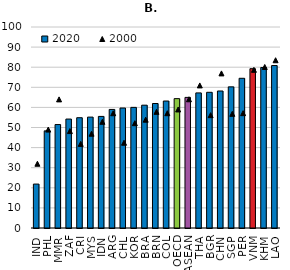
| Category | 2020 |
|---|---|
| IND | 21.852 |
| PHL | 48.333 |
| MMR | 51.464 |
| ZAF | 54.204 |
| CRI | 54.87 |
| MYS | 55.171 |
| IDN | 55.518 |
| ARG | 58.989 |
| CHL | 59.691 |
| KOR | 60.011 |
| BRA | 61.101 |
| BRN | 61.936 |
| COL | 63.172 |
| OECD | 64.358 |
| ASEAN | 64.98 |
| THA | 67.214 |
| BGR | 67.509 |
| CHN | 68.16 |
| SGP | 70.214 |
| PER | 74.485 |
| VNM | 79.266 |
| KHM | 79.864 |
| LAO | 80.817 |